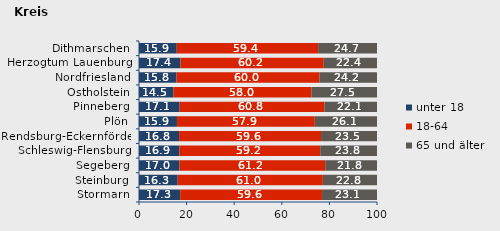
| Category | unter 18 | 18-64 | 65 und älter |
|---|---|---|---|
| Stormarn | 17.298 | 59.577 | 23.125 |
| Steinburg | 16.259 | 60.99 | 22.751 |
| Segeberg | 17.009 | 61.236 | 21.755 |
| Schleswig-Flensburg | 16.939 | 59.213 | 23.848 |
| Rendsburg-Eckernförde | 16.849 | 59.64 | 23.511 |
| Plön | 15.945 | 57.928 | 26.127 |
| Pinneberg | 17.061 | 60.832 | 22.107 |
| Ostholstein | 14.523 | 57.97 | 27.507 |
| Nordfriesland | 15.778 | 60.046 | 24.176 |
| Herzogtum Lauenburg | 17.402 | 60.238 | 22.361 |
| Dithmarschen | 15.877 | 59.378 | 24.744 |